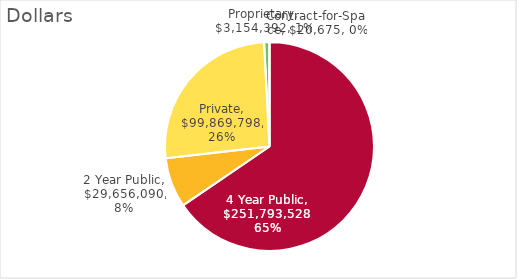
| Category | Series 0 |
|---|---|
| 4 Year Public | 251793527.82 |
| 2 Year Public | 29656089.63 |
| Private | 99869797.9 |
| Proprietary | 3154391.66 |
| Contract-for-Space | 20675 |